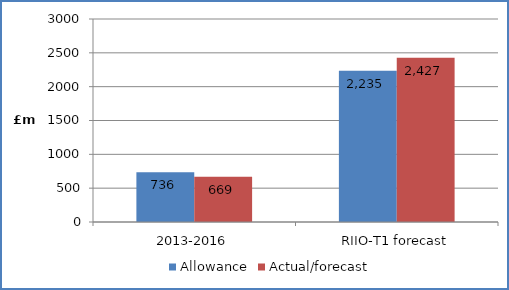
| Category | Allowance | Actual/forecast |
|---|---|---|
| 2013-2016 | 735.578 | 669.077 |
| RIIO-T1 forecast | 2234.908 | 2427.184 |